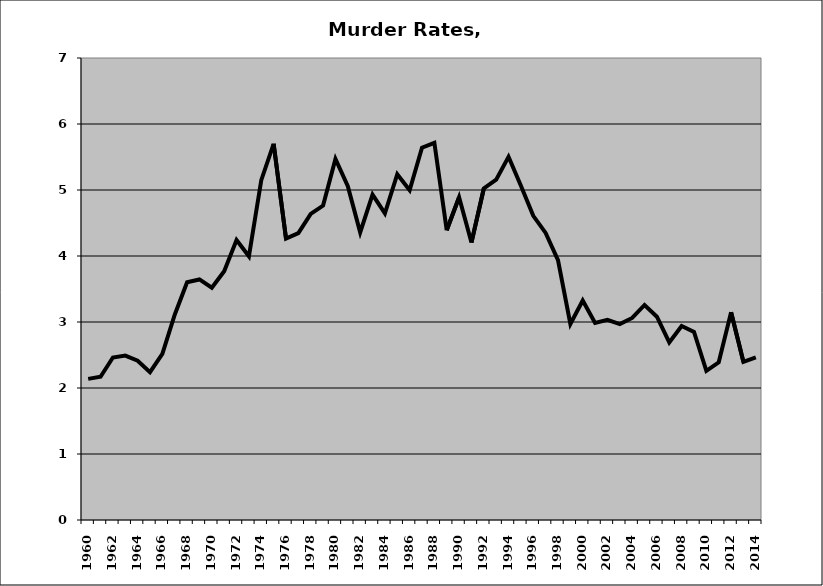
| Category | Murder |
|---|---|
| 1960.0 | 2.138 |
| 1961.0 | 2.171 |
| 1962.0 | 2.462 |
| 1963.0 | 2.492 |
| 1964.0 | 2.413 |
| 1965.0 | 2.241 |
| 1966.0 | 2.517 |
| 1967.0 | 3.11 |
| 1968.0 | 3.602 |
| 1969.0 | 3.645 |
| 1970.0 | 3.52 |
| 1971.0 | 3.769 |
| 1972.0 | 4.24 |
| 1973.0 | 3.995 |
| 1974.0 | 5.15 |
| 1975.0 | 5.7 |
| 1976.0 | 4.264 |
| 1977.0 | 4.347 |
| 1978.0 | 4.637 |
| 1979.0 | 4.763 |
| 1980.0 | 5.47 |
| 1981.0 | 5.057 |
| 1982.0 | 4.358 |
| 1983.0 | 4.93 |
| 1984.0 | 4.645 |
| 1985.0 | 5.239 |
| 1986.0 | 4.997 |
| 1987.0 | 5.641 |
| 1988.0 | 5.716 |
| 1989.0 | 4.39 |
| 1990.0 | 4.89 |
| 1991.0 | 4.205 |
| 1992.0 | 5.023 |
| 1993.0 | 5.157 |
| 1994.0 | 5.503 |
| 1995.0 | 5.064 |
| 1996.0 | 4.609 |
| 1997.0 | 4.349 |
| 1998.0 | 3.937 |
| 1999.0 | 2.971 |
| 2000.0 | 3.325 |
| 2001.0 | 2.987 |
| 2002.0 | 3.033 |
| 2003.0 | 2.968 |
| 2004.0 | 3.061 |
| 2005.0 | 3.258 |
| 2006.0 | 3.08 |
| 2007.0 | 2.69 |
| 2008.0 | 2.939 |
| 2009.0 | 2.851 |
| 2010.0 | 2.26 |
| 2011.0 | 2.389 |
| 2012.0 | 3.147 |
| 2013.0 | 2.395 |
| 2014.0 | 2.464 |